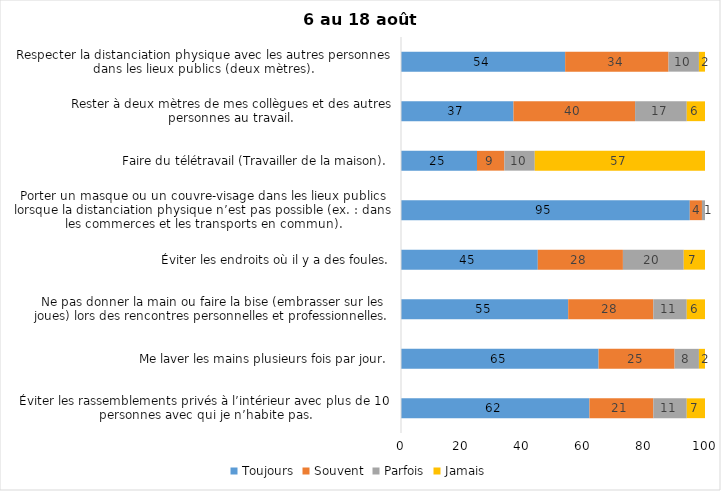
| Category | Toujours | Souvent | Parfois | Jamais |
|---|---|---|---|---|
| Éviter les rassemblements privés à l’intérieur avec plus de 10 personnes avec qui je n’habite pas. | 62 | 21 | 11 | 7 |
| Me laver les mains plusieurs fois par jour. | 65 | 25 | 8 | 2 |
| Ne pas donner la main ou faire la bise (embrasser sur les joues) lors des rencontres personnelles et professionnelles. | 55 | 28 | 11 | 6 |
| Éviter les endroits où il y a des foules. | 45 | 28 | 20 | 7 |
| Porter un masque ou un couvre-visage dans les lieux publics lorsque la distanciation physique n’est pas possible (ex. : dans les commerces et les transports en commun). | 95 | 4 | 1 | 0 |
| Faire du télétravail (Travailler de la maison). | 25 | 9 | 10 | 57 |
| Rester à deux mètres de mes collègues et des autres personnes au travail. | 37 | 40 | 17 | 6 |
| Respecter la distanciation physique avec les autres personnes dans les lieux publics (deux mètres). | 54 | 34 | 10 | 2 |